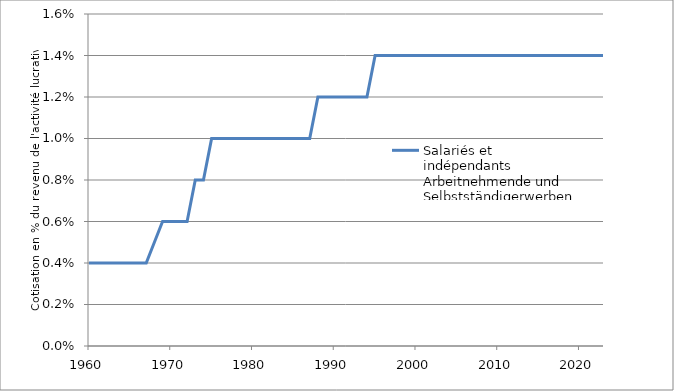
| Category | Salariés et indépendants |
|---|---|
| 1960 | 0.004 |
| 1961 | 0.004 |
| 1962 | 0.004 |
| 1963 | 0.004 |
| 1964 | 0.004 |
| 1965 | 0.004 |
| 1966 | 0.004 |
| 1967 | 0.004 |
| 1968 | 0.005 |
| 1969 | 0.006 |
| 1970 | 0.006 |
| 1971 | 0.006 |
| 1972 | 0.006 |
| 1973 | 0.008 |
| 1974 | 0.008 |
| 1975 | 0.01 |
| 1976 | 0.01 |
| 1977 | 0.01 |
| 1978 | 0.01 |
| 1979 | 0.01 |
| 1980 | 0.01 |
| 1981 | 0.01 |
| 1982 | 0.01 |
| 1983 | 0.01 |
| 1984 | 0.01 |
| 1985 | 0.01 |
| 1986 | 0.01 |
| 1987 | 0.01 |
| 1988 | 0.012 |
| 1989 | 0.012 |
| 1990 | 0.012 |
| 1991 | 0.012 |
| 1992 | 0.012 |
| 1993 | 0.012 |
| 1994 | 0.012 |
| 1995 | 0.014 |
| 1996 | 0.014 |
| 1997 | 0.014 |
| 1998 | 0.014 |
| 1999 | 0.014 |
| 2000 | 0.014 |
| 2001 | 0.014 |
| 2002 | 0.014 |
| 2003 | 0.014 |
| 2004 | 0.014 |
| 2005 | 0.014 |
| 2006 | 0.014 |
| 2007 | 0.014 |
| 2008 | 0.014 |
| 2009 | 0.014 |
| 2010 | 0.014 |
| 2011 | 0.014 |
| 2012 | 0.014 |
| 2013 | 0.014 |
| 2014 | 0.014 |
| 2015 | 0.014 |
| 2016 | 0.014 |
| 2017 | 0.014 |
| 2018 | 0.014 |
| 2019 | 0.014 |
| 2020 | 0.014 |
| 2021 | 0.014 |
| 2022 | 0.014 |
| 2023 | 0.014 |